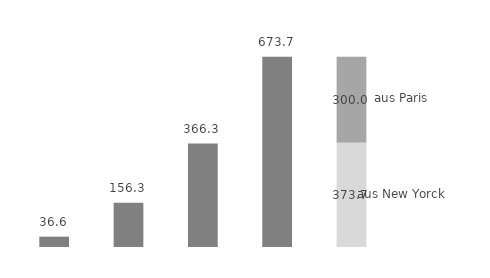
| Category | Menge | aus New Yorck | aus Paris |
|---|---|---|---|
| 2013.0 | 36.6 | 0 | 0 |
| 2014.0 | 156.3 | 0 | 0 |
| 2015.0 | 366.3 | 0 | 0 |
| 2020.0 | 673.7 | 0 | 0 |
| 2020.0 | 0 | 373.7 | 300 |